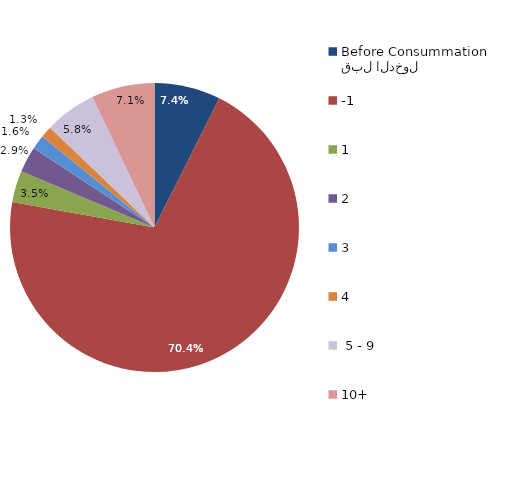
| Category | Series 0 |
|---|---|
| قبل الدخول
Before Consummation | 7.395 |
| -1 | 70.418 |
| 1 | 3.537 |
| 2 | 2.894 |
| 3 | 1.608 |
| 4 | 1.286 |
|  5 - 9 | 5.788 |
| 10+ | 7.074 |